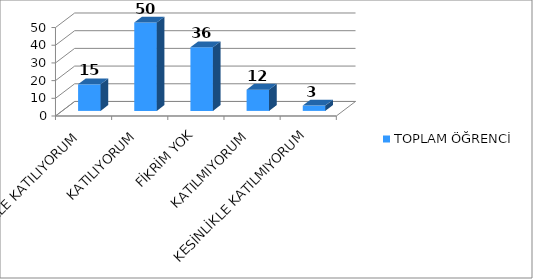
| Category | TOPLAM ÖĞRENCİ |
|---|---|
| KESİNLİKLE KATILIYORUM | 15 |
| KATILIYORUM | 50 |
| FİKRİM YOK | 36 |
| KATILMIYORUM | 12 |
| KESİNLİKLE KATILMIYORUM | 3 |